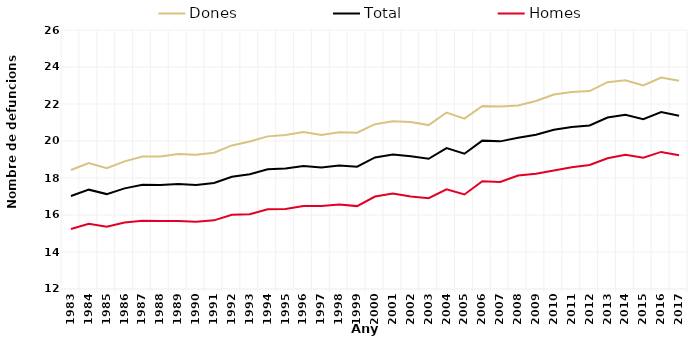
| Category | Dones | Total | Homes |
|---|---|---|---|
| 1983.0 | 18.43 | 17.03 | 15.24 |
| 1984.0 | 18.81 | 17.37 | 15.53 |
| 1985.0 | 18.53 | 17.13 | 15.36 |
| 1986.0 | 18.9 | 17.44 | 15.59 |
| 1987.0 | 19.16 | 17.63 | 15.69 |
| 1988.0 | 19.16 | 17.62 | 15.68 |
| 1989.0 | 19.3 | 17.68 | 15.68 |
| 1990.0 | 19.26 | 17.62 | 15.63 |
| 1991.0 | 19.37 | 17.73 | 15.71 |
| 1992.0 | 19.76 | 18.07 | 16.01 |
| 1993.0 | 19.97 | 18.2 | 16.04 |
| 1994.0 | 20.25 | 18.47 | 16.31 |
| 1995.0 | 20.33 | 18.51 | 16.33 |
| 1996.0 | 20.48 | 18.65 | 16.49 |
| 1997.0 | 20.33 | 18.57 | 16.49 |
| 1998.0 | 20.47 | 18.67 | 16.57 |
| 1999.0 | 20.45 | 18.61 | 16.48 |
| 2000.0 | 20.91 | 19.11 | 17 |
| 2001.0 | 21.07 | 19.27 | 17.16 |
| 2002.0 | 21.03 | 19.17 | 17 |
| 2003.0 | 20.86 | 19.04 | 16.91 |
| 2004.0 | 21.54 | 19.62 | 17.39 |
| 2005.0 | 21.21 | 19.31 | 17.11 |
| 2006.0 | 21.89 | 20.02 | 17.83 |
| 2007.0 | 21.86 | 19.98 | 17.79 |
| 2008.0 | 21.92 | 20.18 | 18.13 |
| 2009.0 | 22.16 | 20.34 | 18.23 |
| 2010.0 | 22.51 | 20.61 | 18.41 |
| 2011.0 | 22.65 | 20.76 | 18.58 |
| 2012.0 | 22.7 | 20.84 | 18.7 |
| 2013.0 | 23.18 | 21.27 | 19.07 |
| 2014.0 | 23.28 | 21.42 | 19.26 |
| 2015.0 | 23 | 21.18 | 19.1 |
| 2016.0 | 23.43 | 21.56 | 19.41 |
| 2017.0 | 23.26 | 21.37 | 19.23 |